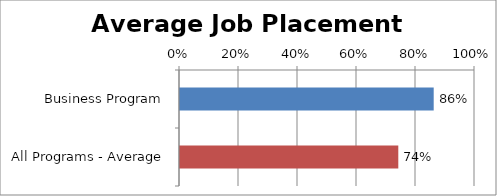
| Category | Series 0 |
|---|---|
| Business Program | 0.86 |
| All Programs - Average | 0.74 |